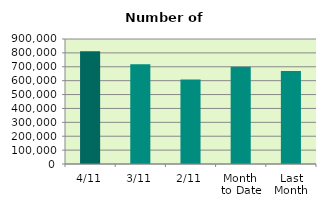
| Category | Series 0 |
|---|---|
| 4/11 | 812000 |
| 3/11 | 718078 |
| 2/11 | 607560 |
| Month 
to Date | 700153 |
| Last
Month | 669366.857 |